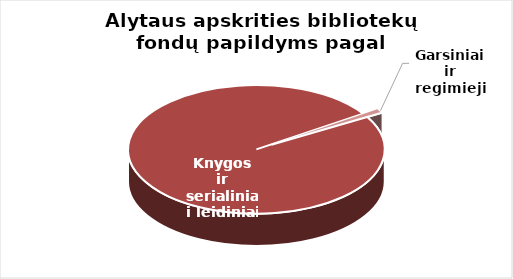
| Category | Series 0 |
|---|---|
| Knygos ir  | 40323 |
| Garsiniai ir regimieji | 423 |